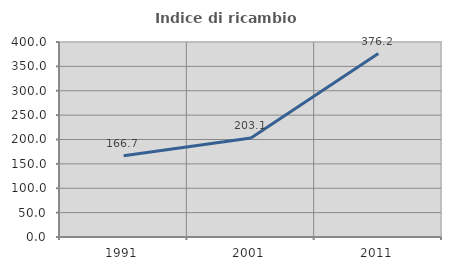
| Category | Indice di ricambio occupazionale  |
|---|---|
| 1991.0 | 166.667 |
| 2001.0 | 203.125 |
| 2011.0 | 376.19 |